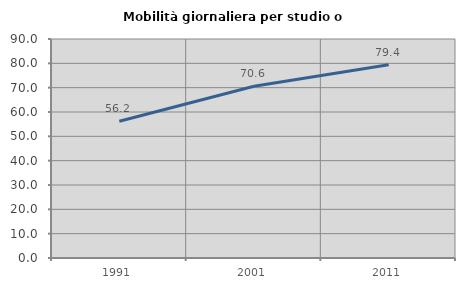
| Category | Mobilità giornaliera per studio o lavoro |
|---|---|
| 1991.0 | 56.19 |
| 2001.0 | 70.555 |
| 2011.0 | 79.391 |